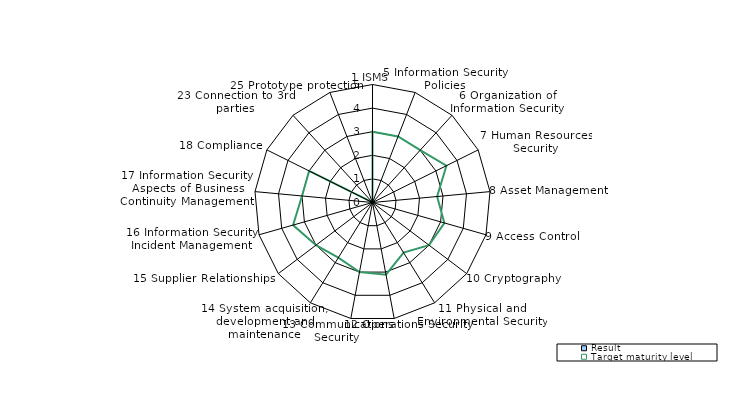
| Category | Result | Target maturity level |
|---|---|---|
| 1 ISMS | 0 | 3 |
| 5 Information Security Policies | 0 | 3 |
| 6 Organization of Information Security | 0 | 3 |
| 7 Human Resources Security | 0 | 3.5 |
| 8 Asset Management | 0 | 2.75 |
| 9 Access Control | 0 | 3.167 |
| 10 Cryptography | 0 | 3 |
| 11 Physical and Environmental Security | 0 | 2.5 |
| 12 Operations Security | 0 | 3.111 |
| 13 Communications Security | 0 | 3 |
| 14 System acquisition, development and maintenance | 0 | 2.75 |
| 15 Supplier Relationships | 0 | 3 |
| 16 Information Security Incident Management | 0 | 3.5 |
| 17 Information Security Aspects of Business Continuity Management | 0 | 3 |
| 18 Compliance | 0 | 3 |
| 23 Connection to 3rd parties | 0 | 0 |
| 25 Prototype protection | 0 | 0 |